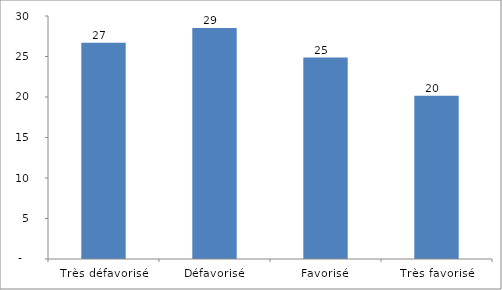
| Category | Motivation  |
|---|---|
| Très défavorisé | 26.697 |
| Défavorisé | 28.514 |
| Favorisé | 24.871 |
| Très favorisé | 20.144 |